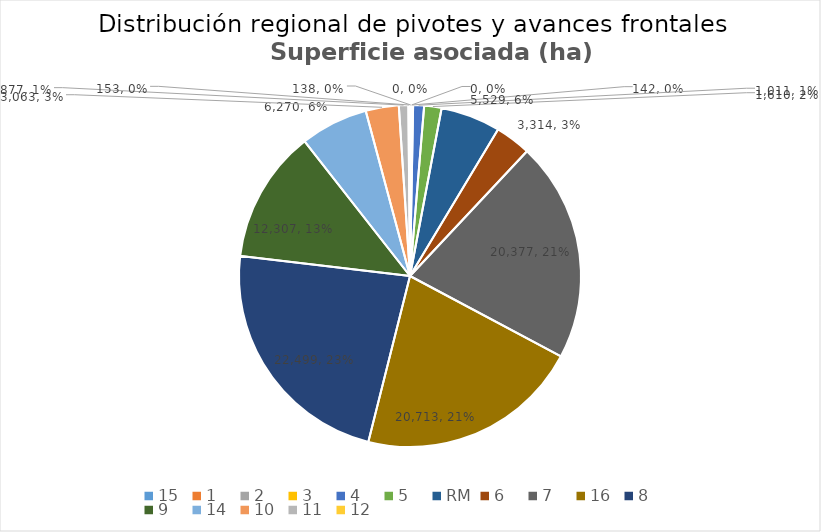
| Category | Superficie (ha) |
|---|---|
| 15 | 138 |
| 1 | 0 |
| 2 | 0 |
| 3 | 142 |
| 4 | 1011 |
| 5 | 1610 |
| RM | 5529 |
| 6 | 3314 |
| 7 | 20377 |
| 16 | 20713 |
| 8 | 22499 |
| 9 | 12307 |
| 14 | 6270 |
| 10 | 3063 |
| 11 | 877 |
| 12 | 153 |